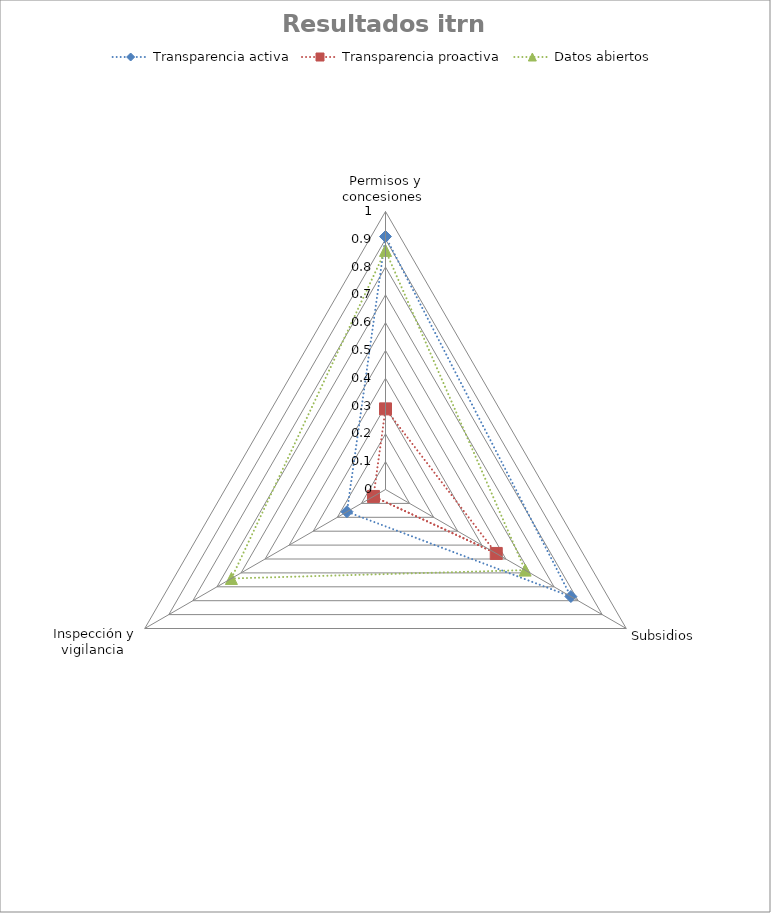
| Category | Transparencia activa | Transparencia proactiva | Datos abiertos |
|---|---|---|---|
| Permisos y concesiones  | 0.91 | 0.29 | 0.86 |
| Subsidios | 0.77 | 0.46 | 0.58 |
| Inspección y vigilancia  | 0.16 | 0.05 | 0.64 |